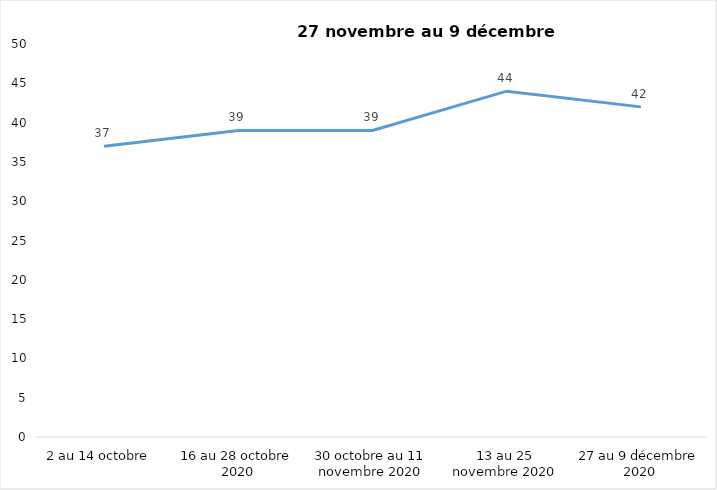
| Category | Series 0 |
|---|---|
| 2 au 14 octobre  | 37 |
| 16 au 28 octobre 2020 | 39 |
| 30 octobre au 11 novembre 2020 | 39 |
| 13 au 25 novembre 2020 | 44 |
| 27 au 9 décembre 2020 | 42 |